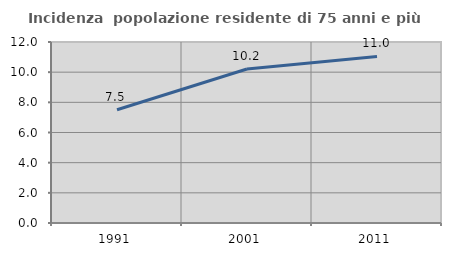
| Category | Incidenza  popolazione residente di 75 anni e più |
|---|---|
| 1991.0 | 7.511 |
| 2001.0 | 10.21 |
| 2011.0 | 11.042 |